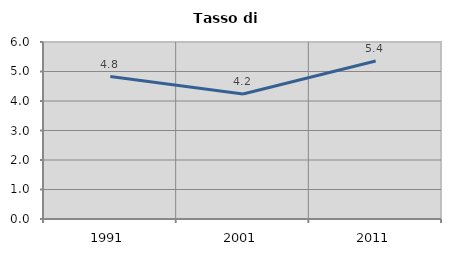
| Category | Tasso di disoccupazione   |
|---|---|
| 1991.0 | 4.83 |
| 2001.0 | 4.237 |
| 2011.0 | 5.353 |